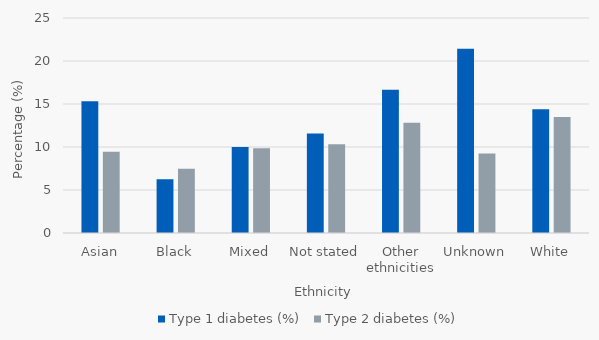
| Category | Type 1 diabetes (%) | Type 2 diabetes (%) |
|---|---|---|
| Asian | 15.315 | 9.452 |
| Black | 6.25 | 7.458 |
| Mixed | 10 | 9.859 |
| Not stated | 11.579 | 10.309 |
| Other ethnicities | 16.667 | 12.821 |
| Unknown | 21.429 | 9.231 |
| White | 14.381 | 13.501 |